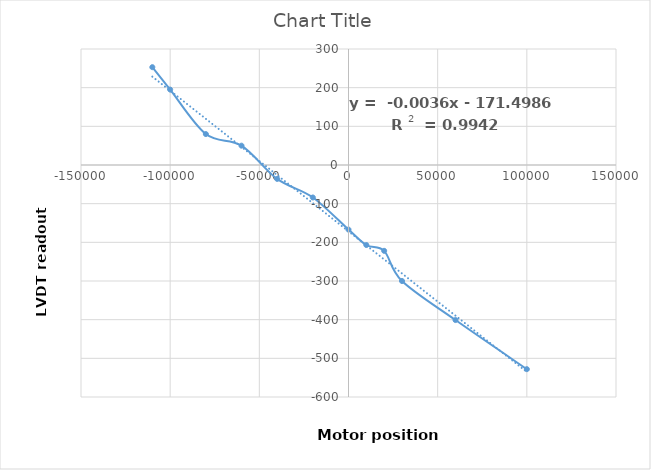
| Category | Series 0 |
|---|---|
| -110000.0 | 253 |
| -100000.0 | 195 |
| -80000.0 | 80 |
| -60000.0 | 50 |
| -40000.0 | -36 |
| -20000.0 | -84 |
| 0.0 | -167 |
| 10000.0 | -207 |
| 20000.0 | -222 |
| 30000.0 | -300 |
| 60000.0 | -401 |
| 100000.0 | -528 |